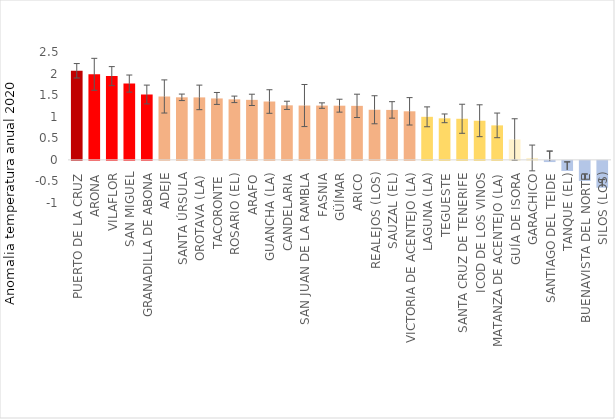
| Category | anomalia TX anual |
|---|---|
| PUERTO DE LA CRUZ | 2.065 |
| ARONA | 1.983 |
| VILAFLOR | 1.941 |
| SAN MIGUEL | 1.768 |
| GRANADILLA DE ABONA | 1.515 |
| ADEJE | 1.47 |
| SANTA ÚRSULA | 1.45 |
| OROTAVA (LA) | 1.448 |
| TACORONTE | 1.423 |
| ROSARIO (EL) | 1.402 |
| ARAFO | 1.391 |
| GUANCHA (LA) | 1.352 |
| CANDELARIA | 1.264 |
| SAN JUAN DE LA RAMBLA | 1.259 |
| FASNIA | 1.258 |
| GÜÍMAR | 1.256 |
| ARICO | 1.252 |
| REALEJOS (LOS) | 1.161 |
| SAUZAL (EL) | 1.157 |
| VICTORIA DE ACENTEJO (LA) | 1.125 |
| LAGUNA (LA) | 0.997 |
| TEGUESTE | 0.962 |
| SANTA CRUZ DE TENERIFE | 0.952 |
| ICOD DE LOS VINOS | 0.907 |
| MATANZA DE ACENTEJO (LA) | 0.799 |
| GUÍA DE ISORA | 0.473 |
| GARACHICO | 0.044 |
| SANTIAGO DEL TEIDE | -0.028 |
| TANQUE (EL) | -0.234 |
| BUENAVISTA DEL NORTE | -0.466 |
| SILOS (LOS) | -0.624 |